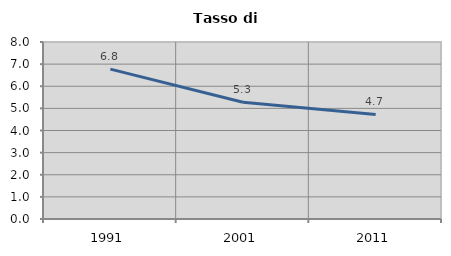
| Category | Tasso di disoccupazione   |
|---|---|
| 1991.0 | 6.775 |
| 2001.0 | 5.279 |
| 2011.0 | 4.728 |